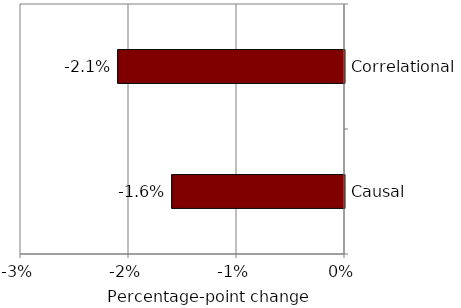
| Category | Series 0 |
|---|---|
| Causal | -0.016 |
| Correlational | -0.021 |